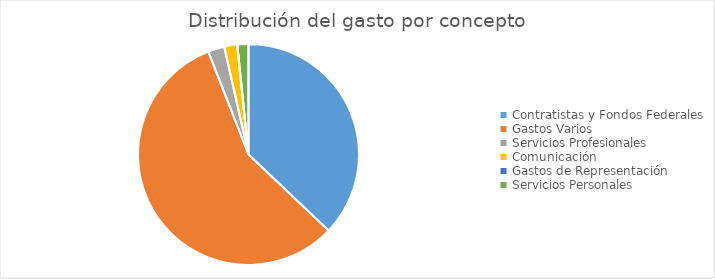
| Category | Series 0 |
|---|---|
| Contratistas y Fondos Federales | 227233620.79 |
| Gastos Varios | 349041058.44 |
| Servicios Profesionales | 14767101.85 |
| Comunicación | 11509421.59 |
| Gastos de Representación | 149561.09 |
| Servicios Personales | 9897686.1 |